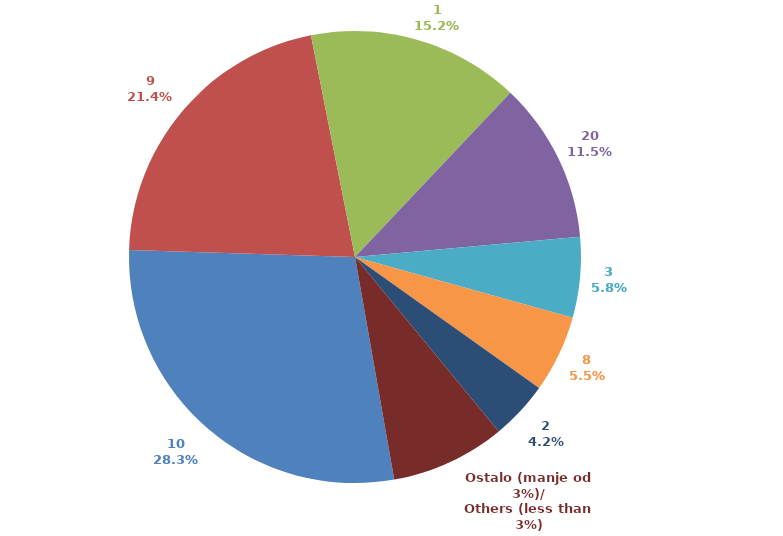
| Category | Series 0 | Series 1 |
|---|---|---|
| 10 | 2092710.145 | 0.283 |
| 9 | 1583857.976 | 0.214 |
| 1 | 1124465.223 | 0.152 |
| 20 | 852306.371 | 0.115 |
| 3 | 426411.282 | 0.058 |
| 8 | 408182.445 | 0.055 |
| 2 | 309627.52 | 0.042 |
| Ostalo (manje od 3%)/
Others (less than 3%) | 606838.284 | 0.082 |